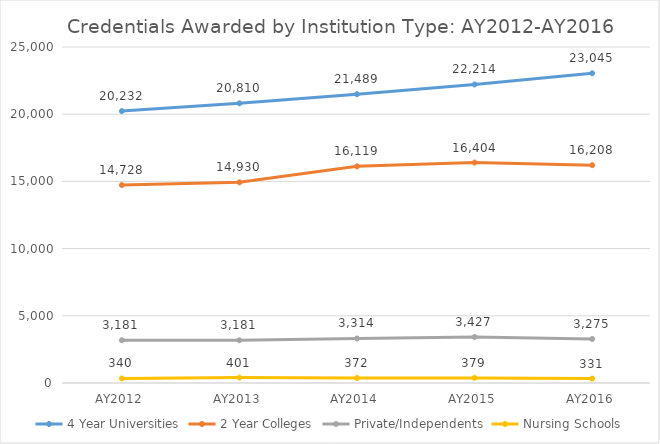
| Category | 4 Year Universities | 2 Year Colleges | Private/Independents | Nursing Schools |
|---|---|---|---|---|
| AY2012 | 20232 | 14728 | 3181 | 340 |
| AY2013 | 20810 | 14930 | 3181 | 401 |
| AY2014 | 21489 | 16119 | 3314 | 372 |
| AY2015 | 22214 | 16404 | 3427 | 379 |
| AY2016 | 23045 | 16208 | 3275 | 331 |